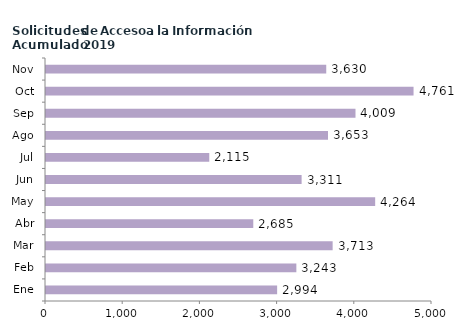
| Category | Series 0 |
|---|---|
| Ene | 2994 |
| Feb | 3243 |
| Mar | 3713 |
| Abr | 2685 |
| May | 4264 |
| Jun | 3311 |
| Jul | 2115 |
| Ago | 3653 |
| Sep | 4009 |
| Oct | 4761 |
| Nov | 3630 |